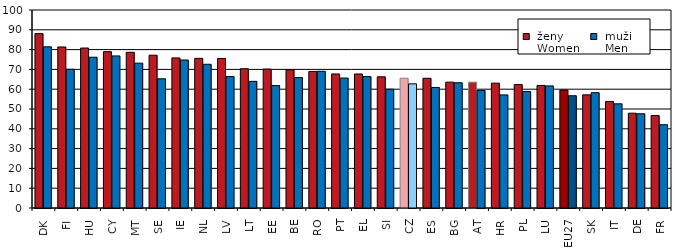
| Category |  ženy 
 Women |  muži 
 Men |
|---|---|---|
| DK | 88.078 | 81.411 |
| FI | 81.333 | 70.064 |
| HU | 80.793 | 76.153 |
| CY | 78.961 | 76.802 |
| MT | 78.635 | 73.155 |
| SE | 77.155 | 65.252 |
| IE | 75.806 | 74.755 |
| NL | 75.582 | 72.601 |
| LV | 75.515 | 66.396 |
| LT | 70.333 | 63.967 |
| EE | 70.158 | 61.821 |
| BE | 69.799 | 65.859 |
| RO | 68.975 | 69.055 |
| PT | 67.706 | 65.639 |
| EL | 67.686 | 66.359 |
| SI | 66.269 | 59.984 |
| CZ | 65.552 | 62.711 |
| ES | 65.516 | 60.874 |
| BG | 63.572 | 63.261 |
| AT | 63.541 | 59.369 |
| HR | 63.06 | 57.133 |
| PL | 62.316 | 58.827 |
| LU | 61.906 | 61.652 |
| EU27 | 59.562 | 56.698 |
| SK | 57.14 | 58.231 |
| IT | 53.754 | 52.612 |
| DE | 47.88 | 47.581 |
| FR | 46.695 | 42.06 |